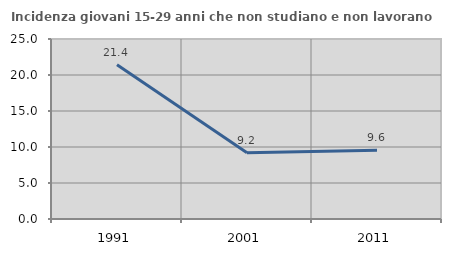
| Category | Incidenza giovani 15-29 anni che non studiano e non lavorano  |
|---|---|
| 1991.0 | 21.411 |
| 2001.0 | 9.202 |
| 2011.0 | 9.554 |